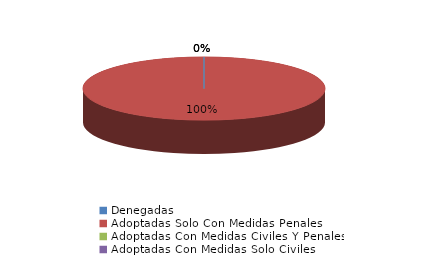
| Category | Series 0 |
|---|---|
| Denegadas | 0 |
| Adoptadas Solo Con Medidas Penales | 7 |
| Adoptadas Con Medidas Civiles Y Penales | 0 |
| Adoptadas Con Medidas Solo Civiles | 0 |